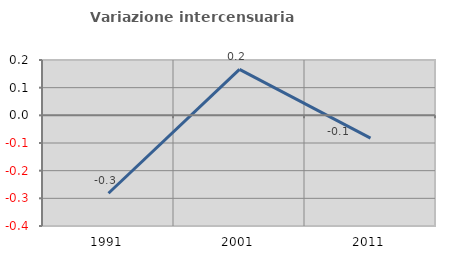
| Category | Variazione intercensuaria annua |
|---|---|
| 1991.0 | -0.282 |
| 2001.0 | 0.166 |
| 2011.0 | -0.083 |